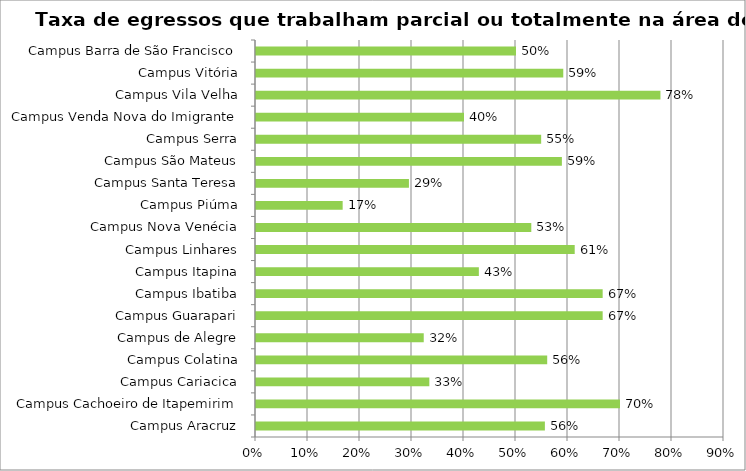
| Category | Series 0 |
|---|---|
| Campus Aracruz | 0.556 |
| Campus Cachoeiro de Itapemirim | 0.7 |
| Campus Cariacica | 0.333 |
| Campus Colatina | 0.56 |
| Campus de Alegre | 0.323 |
| Campus Guarapari | 0.667 |
| Campus Ibatiba | 0.667 |
| Campus Itapina | 0.429 |
| Campus Linhares | 0.613 |
| Campus Nova Venécia | 0.529 |
| Campus Piúma | 0.167 |
| Campus Santa Teresa | 0.294 |
| Campus São Mateus | 0.588 |
| Campus Serra | 0.548 |
| Campus Venda Nova do Imigrante | 0.4 |
| Campus Vila Velha | 0.778 |
| Campus Vitória | 0.591 |
| Campus Barra de São Francisco | 0.5 |